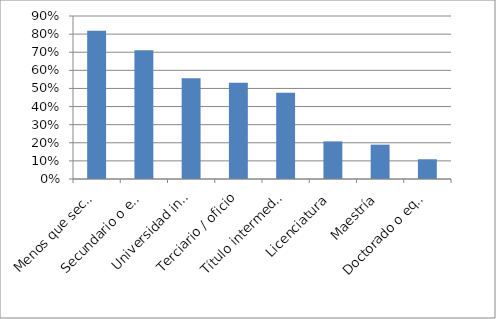
| Category | Series 0 |
|---|---|
| Menos que secundario | 0.819 |
| Secundario o equivalente | 0.712 |
| Universidad incompleta | 0.557 |
| Terciario / oficio | 0.532 |
| Título intermedio | 0.476 |
| Licenciatura | 0.208 |
| Maestría | 0.19 |
| Doctorado o equivalente | 0.109 |